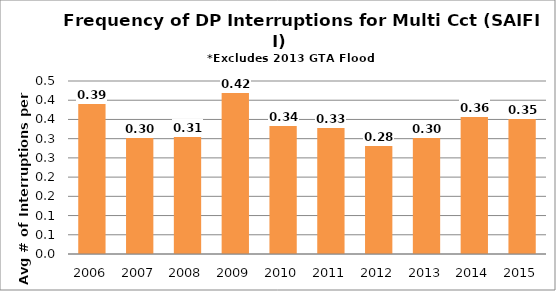
| Category | T-SAIFI-mc |
|---|---|
| 2006.0 | 0.394 |
| 2007.0 | 0.305 |
| 2008.0 | 0.307 |
| 2009.0 | 0.421 |
| 2010.0 | 0.336 |
| 2011.0 | 0.329 |
| 2012.0 | 0.284 |
| 2013.0 | 0.303 |
| 2014.0 | 0.358 |
| 2015.0 | 0.354 |